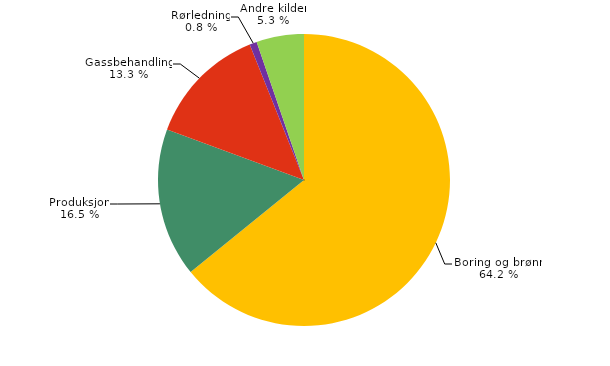
| Category | Series 0 |
|---|---|
| Boring og brønn | 102.778 |
| Produksjon | 26.39 |
| Gassbehandling | 21.32 |
| Rørledning | 1.3 |
| Andre kilder | 8.415 |